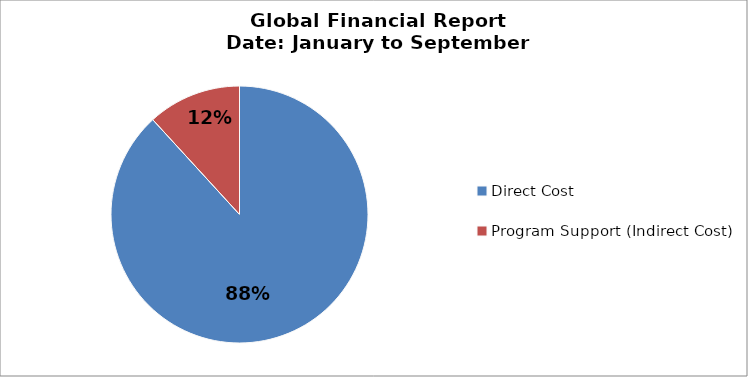
| Category | Total Expenses |
|---|---|
| Direct Cost | 101046.98 |
| Program Support (Indirect Cost) | 13509.91 |